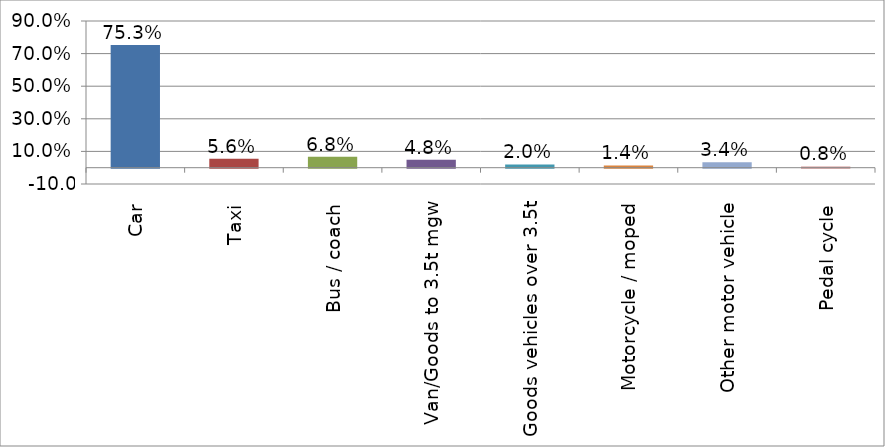
| Category | Series 0 |
|---|---|
| Car | 0.753 |
| Taxi | 0.056 |
| Bus / coach | 0.068 |
| Van/Goods to 3.5t mgw | 0.048 |
| Goods vehicles over 3.5t | 0.02 |
| Motorcycle / moped | 0.014 |
| Other motor vehicle | 0.034 |
| Pedal cycle | 0.008 |